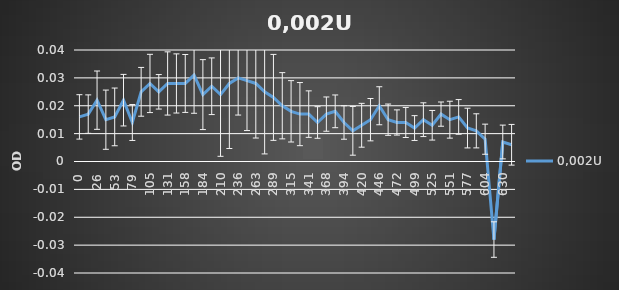
| Category | 0,002U |
|---|---|
| 0.0 | 0.016 |
| 13.0 | 0.017 |
| 26.0 | 0.022 |
| 39.0 | 0.015 |
| 53.0 | 0.016 |
| 66.0 | 0.022 |
| 79.0 | 0.014 |
| 92.0 | 0.025 |
| 105.0 | 0.028 |
| 118.0 | 0.025 |
| 131.0 | 0.028 |
| 144.0 | 0.028 |
| 158.0 | 0.028 |
| 171.0 | 0.031 |
| 184.0 | 0.024 |
| 197.0 | 0.027 |
| 210.0 | 0.024 |
| 223.0 | 0.028 |
| 236.0 | 0.03 |
| 249.0 | 0.029 |
| 263.0 | 0.028 |
| 276.0 | 0.025 |
| 289.0 | 0.023 |
| 302.0 | 0.02 |
| 315.0 | 0.018 |
| 328.0 | 0.017 |
| 341.0 | 0.017 |
| 354.0 | 0.014 |
| 368.0 | 0.017 |
| 381.0 | 0.018 |
| 394.0 | 0.014 |
| 407.0 | 0.011 |
| 420.0 | 0.013 |
| 433.0 | 0.015 |
| 446.0 | 0.02 |
| 459.0 | 0.015 |
| 472.0 | 0.014 |
| 486.0 | 0.014 |
| 499.0 | 0.012 |
| 512.0 | 0.015 |
| 525.0 | 0.013 |
| 538.0 | 0.017 |
| 551.0 | 0.015 |
| 564.0 | 0.016 |
| 577.0 | 0.012 |
| 591.0 | 0.011 |
| 604.0 | 0.008 |
| 617.0 | -0.028 |
| 630.0 | 0.007 |
| 643.0 | 0.006 |